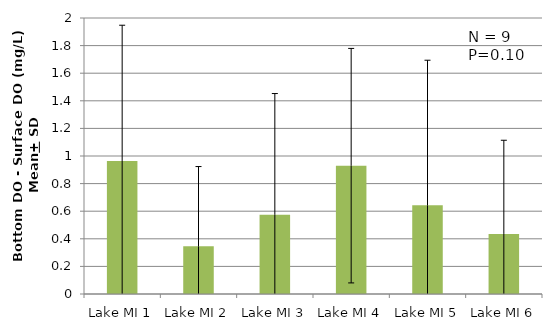
| Category | Series 2 |
|---|---|
| Lake MI 1 | 0.964 |
| Lake MI 2 | 0.346 |
| Lake MI 3 | 0.574 |
| Lake MI 4 | 0.93 |
| Lake MI 5 | 0.642 |
| Lake MI 6 | 0.436 |